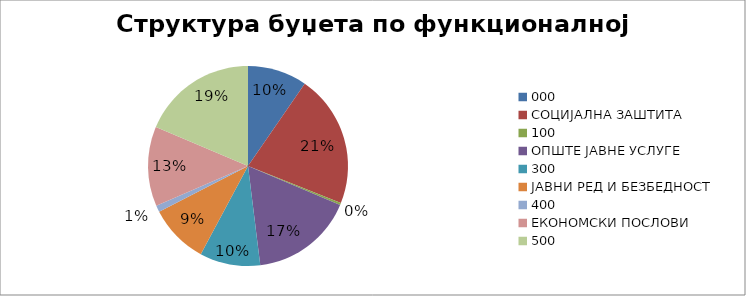
| Category | Series 0 |
|---|---|
| 0 | 82170000 |
| 1 | 183509641 |
| 2 | 2700000 |
| 3 | 142700000 |
| 4 | 83750000 |
| 5 | 82090000 |
| 6 | 9000000 |
| 7 | 110230359 |
| 8 | 159500000 |